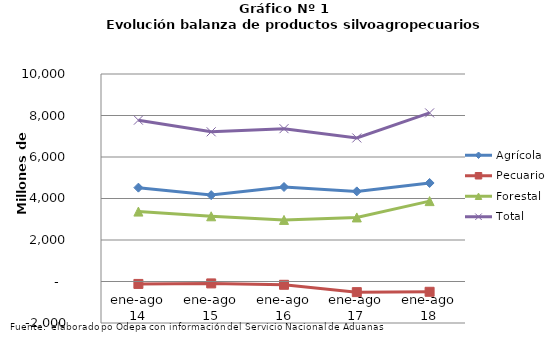
| Category | Agrícola | Pecuario | Forestal | Total |
|---|---|---|---|---|
| ene-ago 14 | 4523175 | -117032 | 3369241 | 7775384 |
| ene-ago 15 | 4163385 | -92194 | 3142648 | 7213839 |
| ene-ago 16 | 4554934 | -158186 | 2968510 | 7365258 |
| ene-ago 17 | 4343372 | -512679 | 3086758 | 6917451 |
| ene-ago 18 | 4747205 | -495736 | 3873855 | 8125324 |